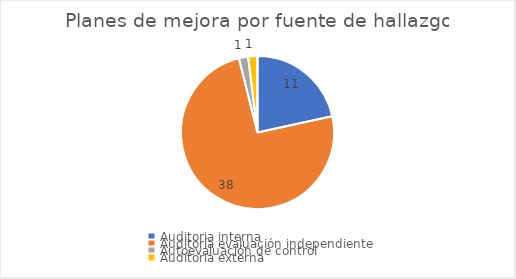
| Category | Series 0 |
|---|---|
| Auditoria interna | 11 |
| Auditoría evaluación independiente | 38 |
| Autoevaluación de control | 1 |
| Auditoria externa | 1 |